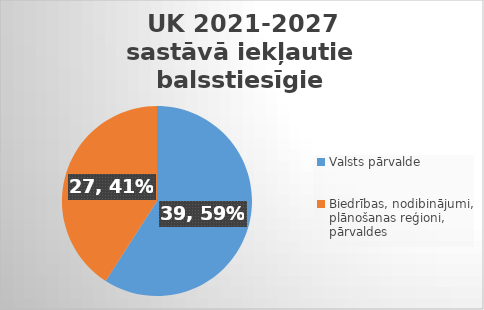
| Category | Series 0 |
|---|---|
| Valsts pārvalde | 39 |
| Biedrības, nodibinājumi, plānošanas reģioni, pārvaldes | 27 |